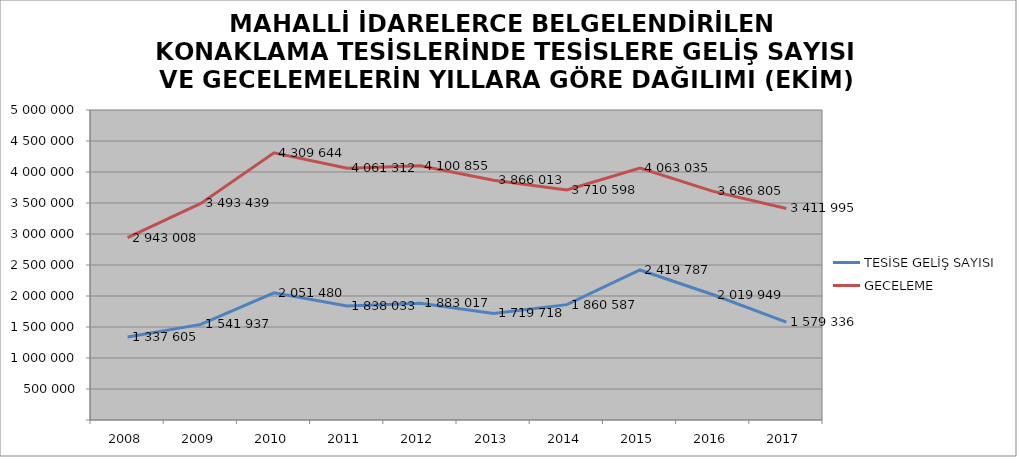
| Category | TESİSE GELİŞ SAYISI | GECELEME |
|---|---|---|
| 2008 | 1337605 | 2943008 |
| 2009 | 1541937 | 3493439 |
| 2010 | 2051480 | 4309644 |
| 2011 | 1838033 | 4061312 |
| 2012 | 1883017 | 4100855 |
| 2013 | 1719718 | 3866013 |
| 2014 | 1860587 | 3710598 |
| 2015 | 2419787 | 4063035 |
| 2016 | 2019949 | 3686805 |
| 2017 | 1579336 | 3411995 |